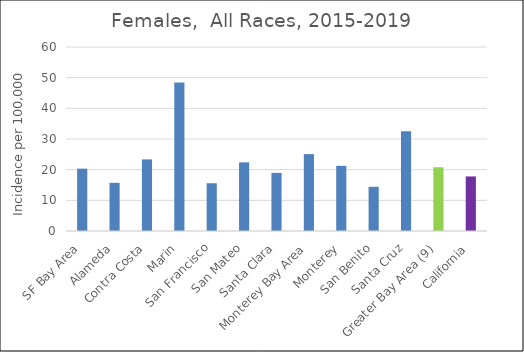
| Category | Female |
|---|---|
| SF Bay Area | 20.33 |
|   Alameda | 15.71 |
|   Contra Costa | 23.35 |
|   Marin | 48.45 |
|   San Francisco | 15.58 |
|   San Mateo | 22.38 |
|   Santa Clara | 18.95 |
| Monterey Bay Area | 25.07 |
|   Monterey | 21.25 |
|   San Benito | 14.41 |
|   Santa Cruz | 32.55 |
| Greater Bay Area (9) | 20.79 |
| California | 17.79 |